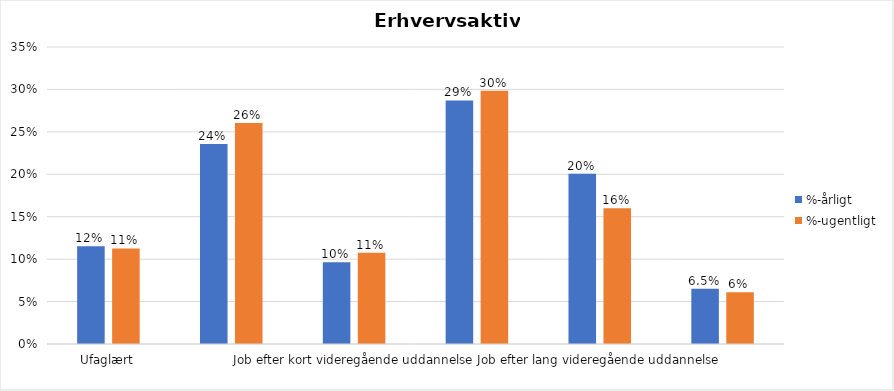
| Category | %-årligt | %-ugentligt |
|---|---|---|
| Ufaglært | 0.115 | 0.113 |
| Erhvervsfagligt job | 0.236 | 0.261 |
| Job efter kort videregående uddannelse | 0.096 | 0.108 |
| Job efter mellemlang videregående uddannelse | 0.287 | 0.298 |
| Job efter lang videregående uddannelse | 0.201 | 0.16 |
| Selvstændig | 0.065 | 0.061 |